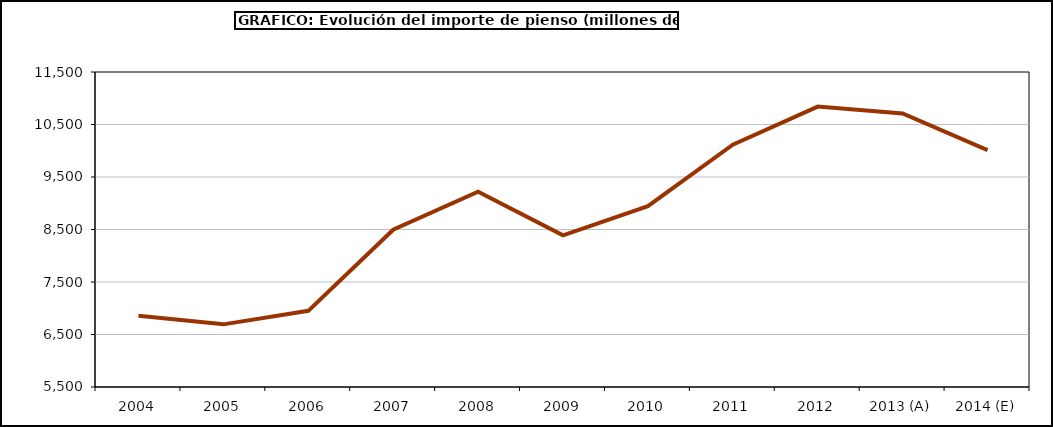
| Category | piensos |
|---|---|
| 2004 | 6857.129 |
| 2005 | 6693.171 |
| 2006 | 6950.753 |
| 2007 | 8496.174 |
| 2008 | 9220.925 |
| 2009 | 8388.144 |
| 2010 | 8943.629 |
| 2011 | 10115.595 |
| 2012 | 10840.701 |
| 2013 (A) | 10710.988 |
| 2014 (E) | 10010.661 |